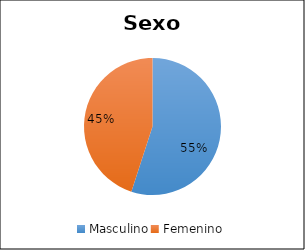
| Category | Series 0 |
|---|---|
| Masculino | 11 |
| Femenino | 9 |